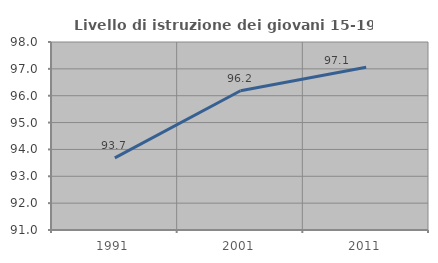
| Category | Livello di istruzione dei giovani 15-19 anni |
|---|---|
| 1991.0 | 93.684 |
| 2001.0 | 96.183 |
| 2011.0 | 97.059 |